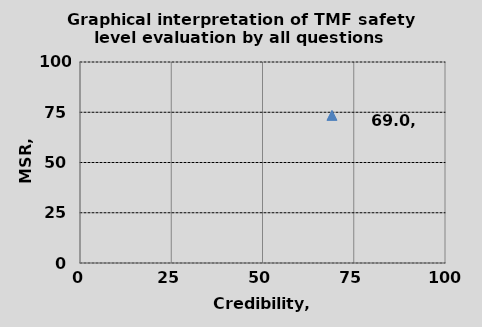
| Category | B |
|---|---|
| 69.03454256395433 | 73.46 |